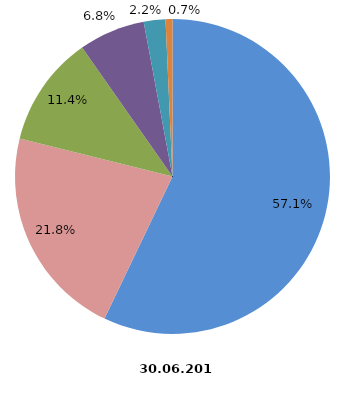
| Category | Anzahl Betriebe 2019 |
|---|---|
| 1 - 4 Beschäftigte | 1696 |
| 5 - 9 Beschäftigte | 647 |
| 10 - 19 Beschäftigte | 338 |
| 20 - 49 Beschäftigte | 202 |
| 50 - 99 Beschäftigte | 66 |
| 100 und mehr Beschäftigte | 21 |